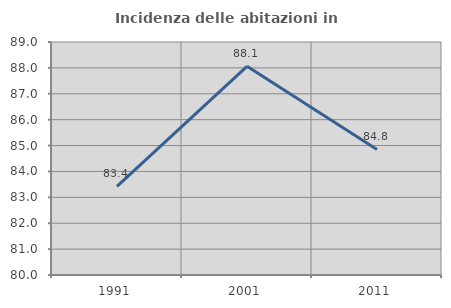
| Category | Incidenza delle abitazioni in proprietà  |
|---|---|
| 1991.0 | 83.427 |
| 2001.0 | 88.062 |
| 2011.0 | 84.848 |